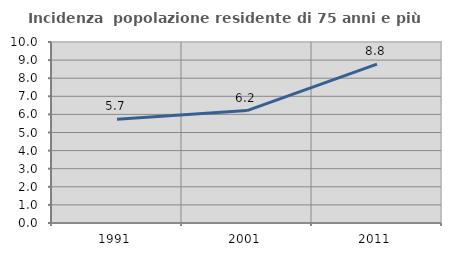
| Category | Incidenza  popolazione residente di 75 anni e più |
|---|---|
| 1991.0 | 5.726 |
| 2001.0 | 6.213 |
| 2011.0 | 8.78 |